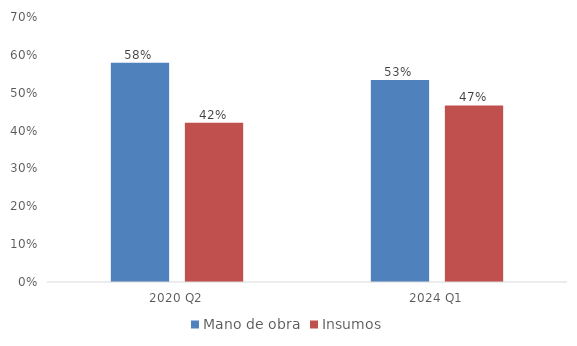
| Category | Mano de obra | Insumos |
|---|---|---|
| 2020 Q2 | 0.579 | 0.421 |
| 2024 Q1 | 0.534 | 0.466 |